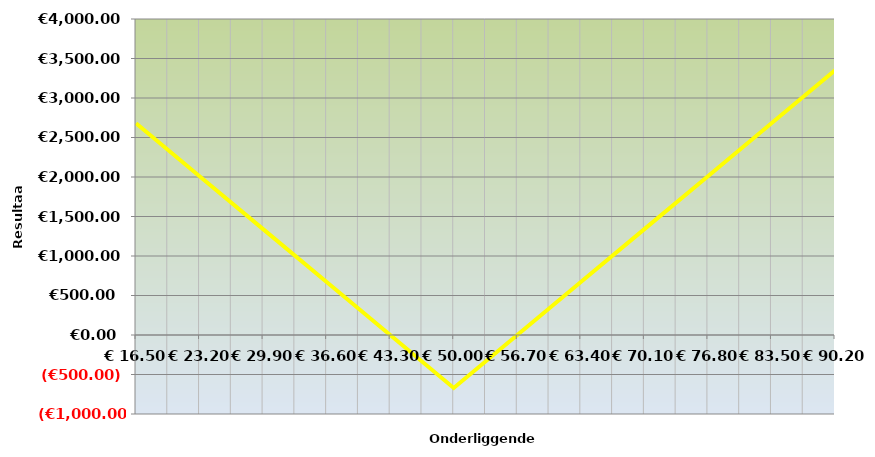
| Category | Series 3 |
|---|---|
| 16.499999999999996 | 2680 |
| 23.199999999999996 | 2010 |
| 29.899999999999995 | 1340 |
| 36.599999999999994 | 670 |
| 43.3 | 0 |
| 50.0 | -670 |
| 56.7 | 0 |
| 63.400000000000006 | 670 |
| 70.10000000000001 | 1340 |
| 76.80000000000001 | 2010 |
| 83.50000000000001 | 2680 |
| 90.20000000000002 | 3350 |